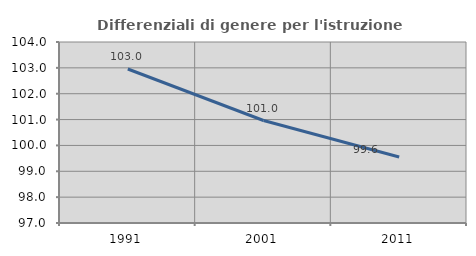
| Category | Differenziali di genere per l'istruzione superiore |
|---|---|
| 1991.0 | 102.957 |
| 2001.0 | 100.964 |
| 2011.0 | 99.553 |